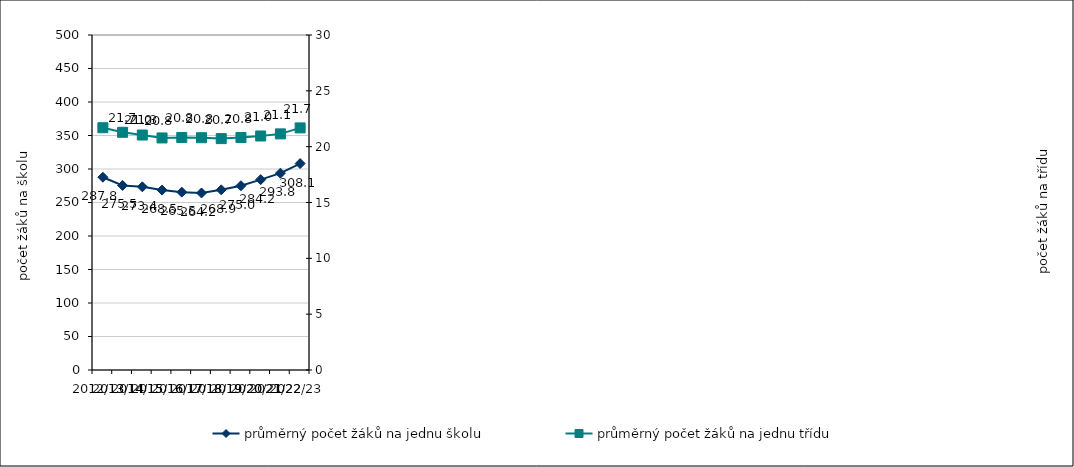
| Category | průměrný počet žáků na jednu školu |
|---|---|
| 2012/13 | 287.755 |
| 2013/14 | 275.463 |
| 2014/15 | 273.413 |
| 2015/16 | 268.538 |
| 2016/17 | 265.456 |
| 2017/18 | 264.199 |
| 2018/19 | 268.935 |
| 2019/20 | 275.023 |
| 2020/21 | 284.178 |
| 2021/22 | 293.787 |
| 2022/23 | 308.087 |